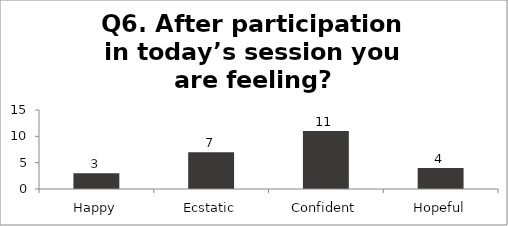
| Category | Q6. After participation in today’s session you are feeling? |
|---|---|
| Happy | 3 |
| Ecstatic | 7 |
| Confident | 11 |
| Hopeful | 4 |